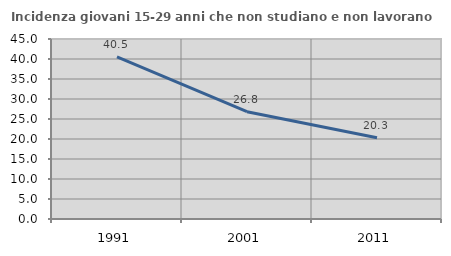
| Category | Incidenza giovani 15-29 anni che non studiano e non lavorano  |
|---|---|
| 1991.0 | 40.506 |
| 2001.0 | 26.818 |
| 2011.0 | 20.321 |